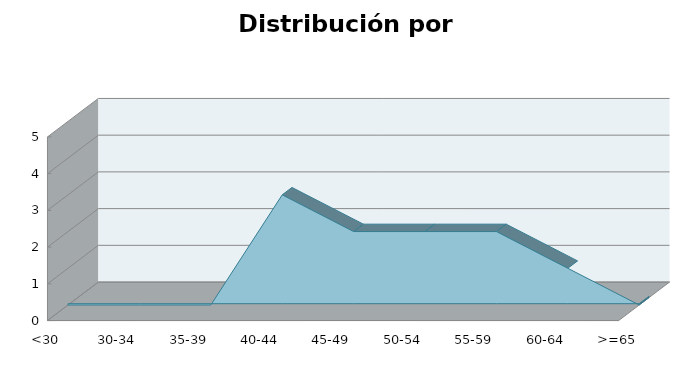
| Category | Series 1 |
|---|---|
| <30 | 0 |
| 30-34 | 0 |
| 35-39 | 0 |
| 40-44 | 3 |
| 45-49 | 2 |
| 50-54 | 2 |
| 55-59 | 2 |
| 60-64 | 1 |
| >=65 | 0 |